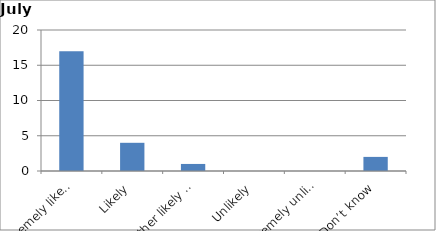
| Category | Series 0 |
|---|---|
| Extremely likely | 17 |
| Likely | 4 |
| Neither likely nor unlikely | 1 |
| Unlikely | 0 |
| Extremely unlikely | 0 |
| Don’t know | 2 |